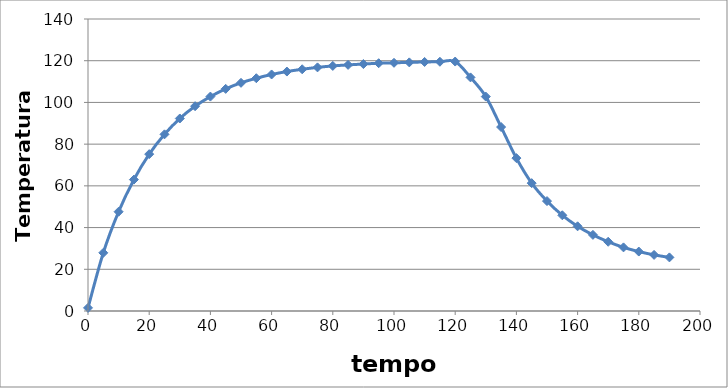
| Category | T (oC) |
|---|---|
| 0.0 | 1.5 |
| 5.0 | 27.9 |
| 10.0 | 47.6 |
| 15.0 | 63 |
| 20.0 | 75.2 |
| 25.0 | 84.7 |
| 30.0 | 92.3 |
| 35.0 | 98.2 |
| 40.0 | 102.8 |
| 45.0 | 106.5 |
| 50.0 | 109.4 |
| 55.0 | 111.6 |
| 60.0 | 113.4 |
| 65.0 | 114.8 |
| 70.0 | 115.9 |
| 75.0 | 116.8 |
| 80.0 | 117.5 |
| 85.0 | 118 |
| 90.0 | 118.4 |
| 95.0 | 118.8 |
| 100.0 | 119 |
| 105.0 | 119.2 |
| 110.0 | 119.4 |
| 115.0 | 119.5 |
| 120.0 | 119.6 |
| 125.0 | 112 |
| 130.0 | 102.8 |
| 135.0 | 88.2 |
| 140.0 | 73.3 |
| 145.0 | 61.3 |
| 150.0 | 52.7 |
| 155.0 | 45.9 |
| 160.0 | 40.6 |
| 165.0 | 36.5 |
| 170.0 | 33.2 |
| 175.0 | 30.5 |
| 180.0 | 28.5 |
| 185.0 | 26.9 |
| 190.0 | 25.7 |